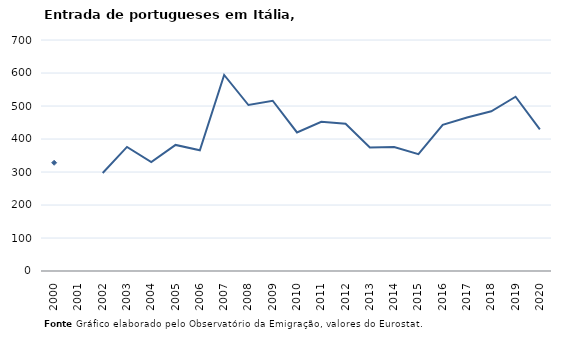
| Category | Entradas |
|---|---|
| 2000.0 | 328 |
| 2001.0 | 0 |
| 2002.0 | 297 |
| 2003.0 | 376 |
| 2004.0 | 330 |
| 2005.0 | 382 |
| 2006.0 | 366 |
| 2007.0 | 594 |
| 2008.0 | 503 |
| 2009.0 | 516 |
| 2010.0 | 420 |
| 2011.0 | 452 |
| 2012.0 | 446 |
| 2013.0 | 374 |
| 2014.0 | 376 |
| 2015.0 | 354 |
| 2016.0 | 443 |
| 2017.0 | 465 |
| 2018.0 | 484 |
| 2019.0 | 528 |
| 2020.0 | 429 |